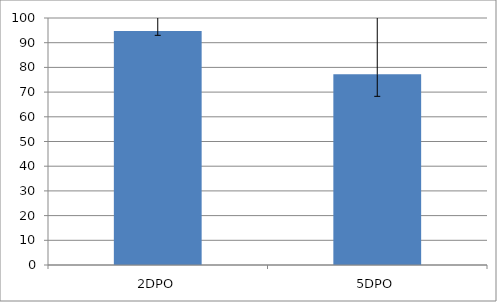
| Category | Series 0 |
|---|---|
| 2DPO | 94.746 |
| 5DPO | 77.252 |